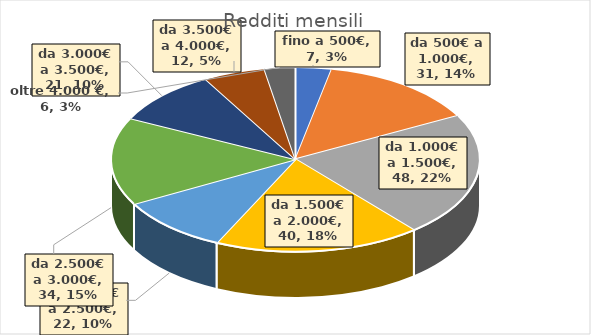
| Category | Series 0 |
|---|---|
| fino a 500€ | 7 |
| da 500€ a 1.000€ | 31 |
| da 1.000€ a 1.500€ | 48 |
| da 1.500€ a 2.000€ | 40 |
| da 2.000€ a 2.500€ | 22 |
| da 2.500€ a 3.000€ | 34 |
| da 3.000€ a 3.500€ | 21 |
| da 3.500€ a 4.000€ | 12 |
| oltre 4.000 € | 6 |